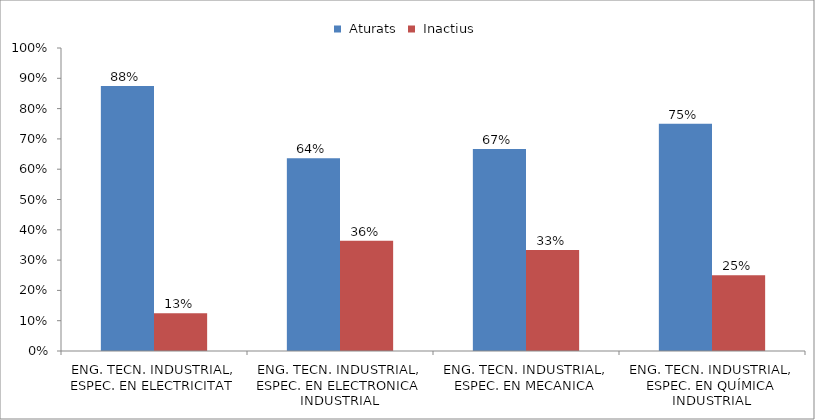
| Category | Aturats | Inactius |
|---|---|---|
| ENG. TECN. INDUSTRIAL, ESPEC. EN ELECTRICITAT | 0.875 | 0.125 |
| ENG. TECN. INDUSTRIAL, ESPEC. EN ELECTRONICA INDUSTRIAL | 0.636 | 0.364 |
| ENG. TECN. INDUSTRIAL, ESPEC. EN MECANICA | 0.667 | 0.333 |
| ENG. TECN. INDUSTRIAL, ESPEC. EN QUÍMICA INDUSTRIAL | 0.75 | 0.25 |